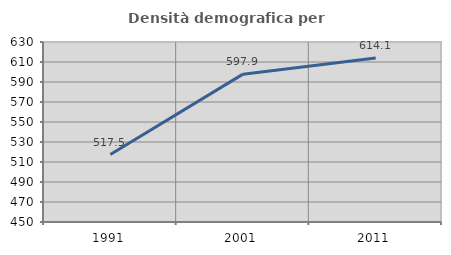
| Category | Densità demografica |
|---|---|
| 1991.0 | 517.479 |
| 2001.0 | 597.852 |
| 2011.0 | 614.067 |